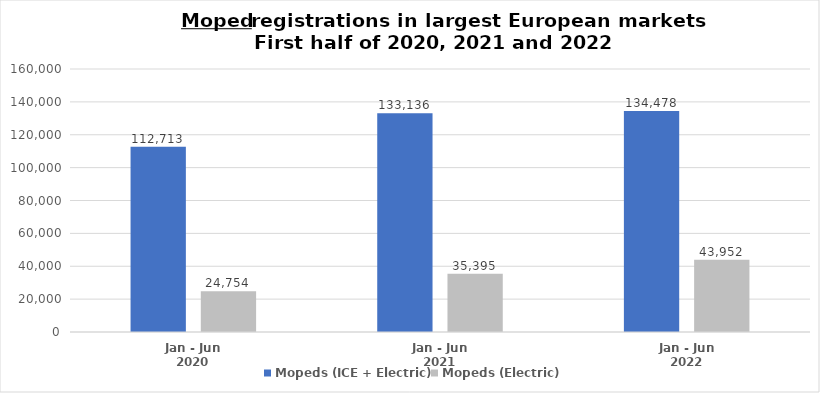
| Category | Mopeds (ICE + Electric)  | Mopeds (Electric)  |
|---|---|---|
| Jan - Jun 2020 | 112713 | 24754 |
| Jan - Jun 2021 | 133136 | 35395 |
| Jan - Jun 2022 | 134478 | 43952 |